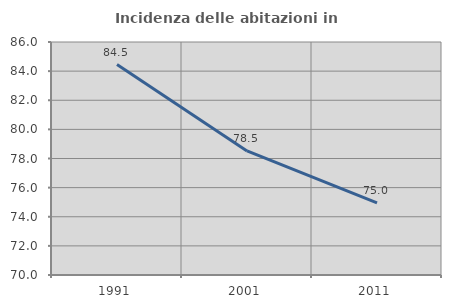
| Category | Incidenza delle abitazioni in proprietà  |
|---|---|
| 1991.0 | 84.45 |
| 2001.0 | 78.517 |
| 2011.0 | 74.951 |